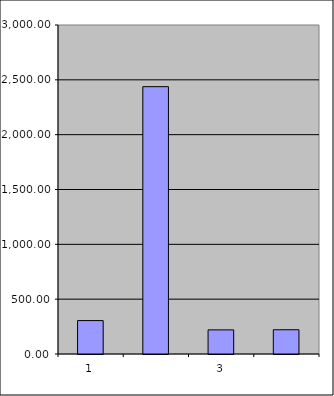
| Category | Series 0 |
|---|---|
| 0 | 304.75 |
| 1 | 2437.557 |
| 2 | 219.866 |
| 3 | 221.034 |